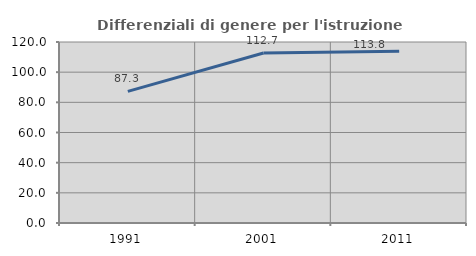
| Category | Differenziali di genere per l'istruzione superiore |
|---|---|
| 1991.0 | 87.273 |
| 2001.0 | 112.683 |
| 2011.0 | 113.788 |